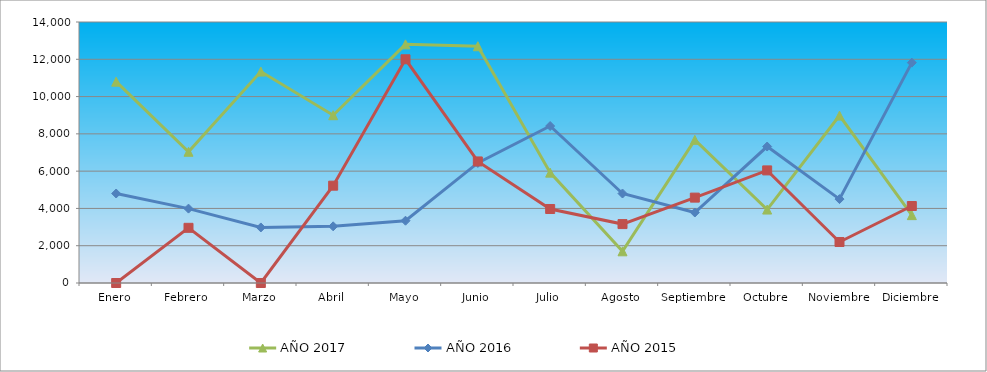
| Category | AÑO 2017 | AÑO 2016 | AÑO 2015 |
|---|---|---|---|
| Enero | 10800 | 4800 | 0 |
| Febrero | 7040 | 3990 | 2960 |
| Marzo | 11340 | 2980 | 0 |
| Abril | 9000 | 3040 | 5220 |
| Mayo | 12800 | 3340 | 12000 |
| Junio | 12700 | 6440 | 6520 |
| Julio | 5920 | 8420 | 3970 |
| Agosto | 1700 | 4800 | 3160 |
| Septiembre | 7680 | 3780 | 4580 |
| Octubre | 3940 | 7320 | 6040 |
| Noviembre | 8980 | 4500 | 2200 |
| Diciembre | 3640 | 11820 | 4130 |